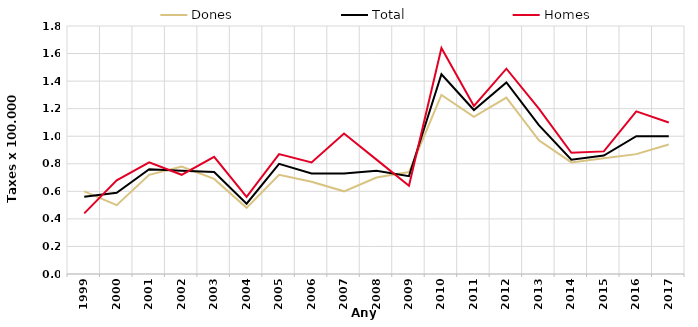
| Category | Dones | Total | Homes |
|---|---|---|---|
| 1999.0 | 0.6 | 0.56 | 0.44 |
| 2000.0 | 0.5 | 0.59 | 0.68 |
| 2001.0 | 0.72 | 0.76 | 0.81 |
| 2002.0 | 0.78 | 0.75 | 0.72 |
| 2003.0 | 0.69 | 0.74 | 0.85 |
| 2004.0 | 0.48 | 0.51 | 0.56 |
| 2005.0 | 0.72 | 0.8 | 0.87 |
| 2006.0 | 0.67 | 0.73 | 0.81 |
| 2007.0 | 0.6 | 0.73 | 1.02 |
| 2008.0 | 0.7 | 0.75 | 0.83 |
| 2009.0 | 0.74 | 0.71 | 0.64 |
| 2010.0 | 1.3 | 1.45 | 1.64 |
| 2011.0 | 1.14 | 1.19 | 1.22 |
| 2012.0 | 1.28 | 1.39 | 1.49 |
| 2013.0 | 0.97 | 1.08 | 1.2 |
| 2014.0 | 0.81 | 0.83 | 0.88 |
| 2015.0 | 0.84 | 0.86 | 0.89 |
| 2016.0 | 0.87 | 1 | 1.18 |
| 2017.0 | 0.94 | 1 | 1.1 |